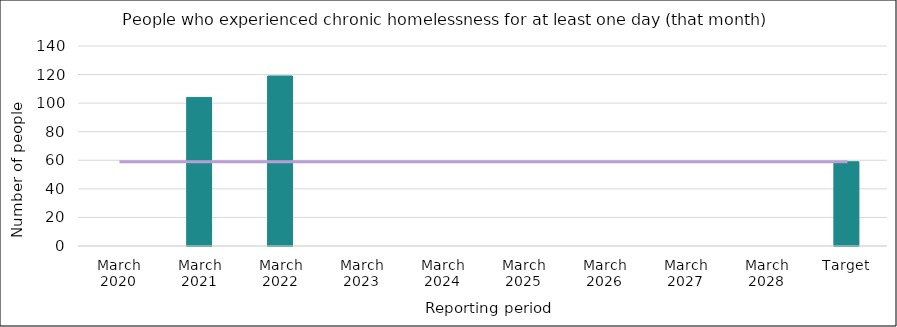
| Category | Series 0 |
|---|---|
| March 2020 | 0 |
| March 2021 | 104 |
| March 2022 | 119 |
| March 2023 | 0 |
| March 2024 | 0 |
| March 2025 | 0 |
| March 2026 | 0 |
| March 2027 | 0 |
| March 2028 | 0 |
| Target | 59 |